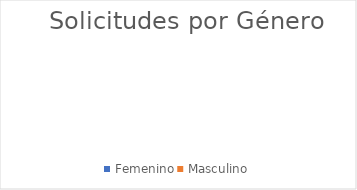
| Category | Series 0 |
|---|---|
| Femenino | 0 |
| Masculino | 0 |